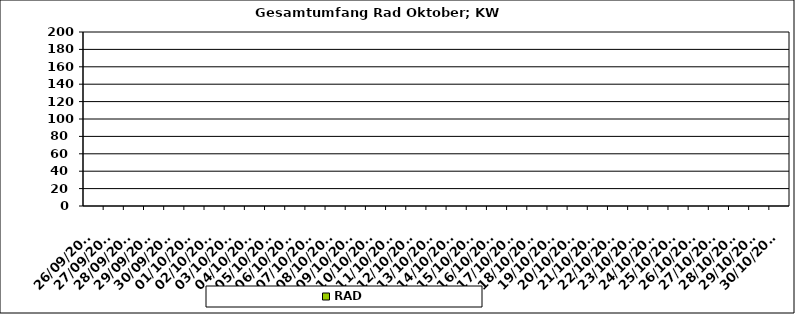
| Category | RAD |
|---|---|
| 26/09/2022 | 0 |
| 27/09/2022 | 0 |
| 28/09/2022 | 0 |
| 29/09/2022 | 0 |
| 30/09/2022 | 0 |
| 01/10/2022 | 0 |
| 02/10/2022 | 0 |
| 03/10/2022 | 0 |
| 04/10/2022 | 0 |
| 05/10/2022 | 0 |
| 06/10/2022 | 0 |
| 07/10/2022 | 0 |
| 08/10/2022 | 0 |
| 09/10/2022 | 0 |
| 10/10/2022 | 0 |
| 11/10/2022 | 0 |
| 12/10/2022 | 0 |
| 13/10/2022 | 0 |
| 14/10/2022 | 0 |
| 15/10/2022 | 0 |
| 16/10/2022 | 0 |
| 17/10/2022 | 0 |
| 18/10/2022 | 0 |
| 19/10/2022 | 0 |
| 20/10/2022 | 0 |
| 21/10/2022 | 0 |
| 22/10/2022 | 0 |
| 23/10/2022 | 0 |
| 24/10/2022 | 0 |
| 25/10/2022 | 0 |
| 26/10/2022 | 0 |
| 27/10/2022 | 0 |
| 28/10/2022 | 0 |
| 29/10/2022 | 0 |
| 30/10/2022 | 0 |